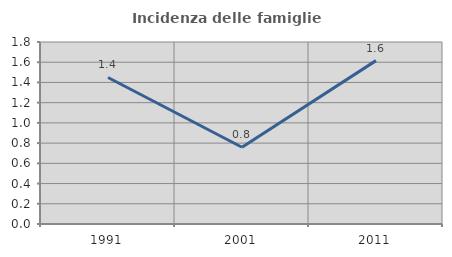
| Category | Incidenza delle famiglie numerose |
|---|---|
| 1991.0 | 1.449 |
| 2001.0 | 0.759 |
| 2011.0 | 1.616 |